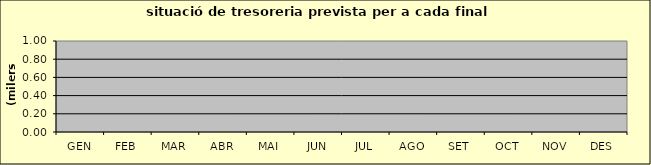
| Category | Series 0 | Series 1 |
|---|---|---|
| GEN | 0 | 0 |
| FEB | 0 | 0 |
| MAR | 0 | 0 |
| ABR | 0 | 0 |
| MAI | 0 | 0 |
| JUN | 0 | 0 |
| JUL | 0 | 0 |
| AGO | 0 | 0 |
| SET | 0 | 0 |
| OCT | 0 | 0 |
| NOV | 0 | 0 |
| DES | 0 | 0 |